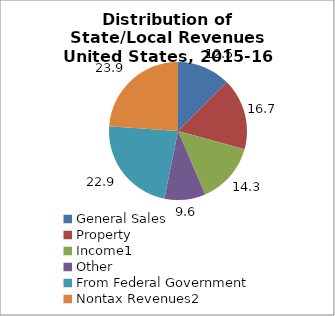
| Category | Series 0 |
|---|---|
| General Sales | 12.532 |
| Property | 16.729 |
| Income1 | 14.312 |
| Other | 9.597 |
| From Federal Government | 22.944 |
| Nontax Revenues2 | 23.886 |